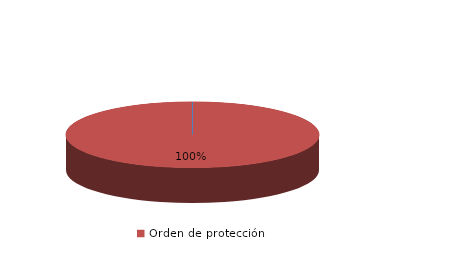
| Category | Series 0 |
|---|---|
| Orden de alejamiento | 0 |
| Orden de protección | 2 |